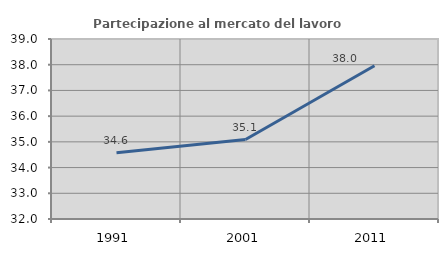
| Category | Partecipazione al mercato del lavoro  femminile |
|---|---|
| 1991.0 | 34.576 |
| 2001.0 | 35.09 |
| 2011.0 | 37.958 |